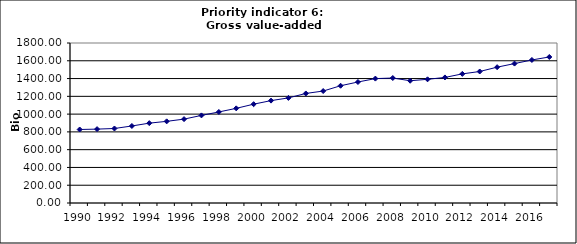
| Category | Gross value-added services, Bio Euro (EC95) |
|---|---|
| 1990 | 827.03 |
| 1991 | 831.245 |
| 1992 | 838.257 |
| 1993 | 866.571 |
| 1994 | 898.346 |
| 1995 | 918.561 |
| 1996 | 943.73 |
| 1997 | 985.48 |
| 1998 | 1024.267 |
| 1999 | 1064.871 |
| 2000 | 1111.666 |
| 2001 | 1151.879 |
| 2002 | 1182.259 |
| 2003 | 1232.364 |
| 2004 | 1259.6 |
| 2005 | 1319.116 |
| 2006 | 1361.304 |
| 2007 | 1399.526 |
| 2008 | 1406.056 |
| 2009 | 1375.467 |
| 2010 | 1391.566 |
| 2011 | 1412.611 |
| 2012 | 1452.492 |
| 2013 | 1479.487 |
| 2014 | 1528.099 |
| 2015 | 1568.387 |
| 2016 | 1609.256 |
| 2017 | 1642.695 |